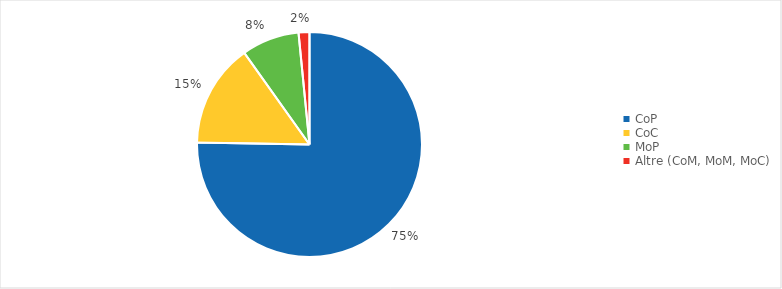
| Category | Series 0 |
|---|---|
| CoP | 0.753 |
| CoC | 0.149 |
| MoP | 0.083 |
| Altre (CoM, MoM, MoC) | 0.016 |